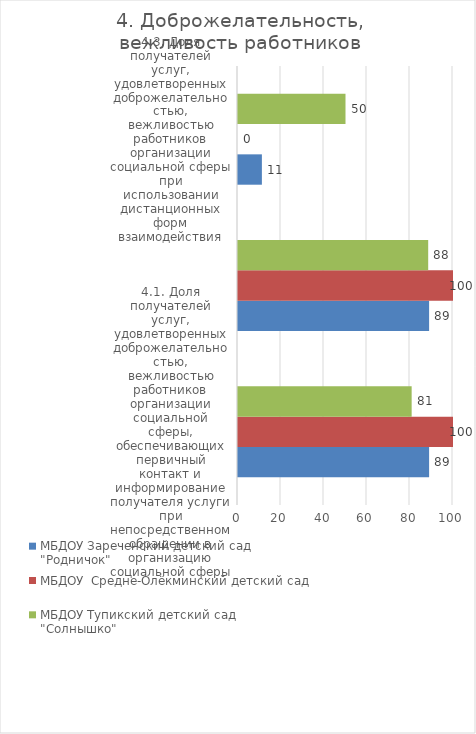
| Category | МБДОУ Зареченский детский сад  "Родничок" | МБДОУ  Средне-Олёкминский детский сад  | МБДОУ Тупикский детский сад  "Солнышко" |
|---|---|---|---|
| 4.1. Доля получателей услуг, удовлетворенных доброжелательностью, вежливостью работников организации социальной сферы, обеспечивающих первичный контакт и информирование получателя услуги при непосредственном обращении в организацию социальной сферы  | 88.889 | 100 | 80.769 |
| 4.2. Доля получателей услуг, удовлетворенных доброжелательностью, вежливостью работников организации социальной сферы, обеспечивающих непосредственное оказание услуги при обращении в организацию социальной сферы | 88.889 | 100 | 88.462 |
| 4.3. Доля получателей услуг, удовлетворенных доброжелательностью, вежливостью работников организации социальной сферы при использовании дистанционных форм взаимодействия | 11.111 | 0 | 50 |